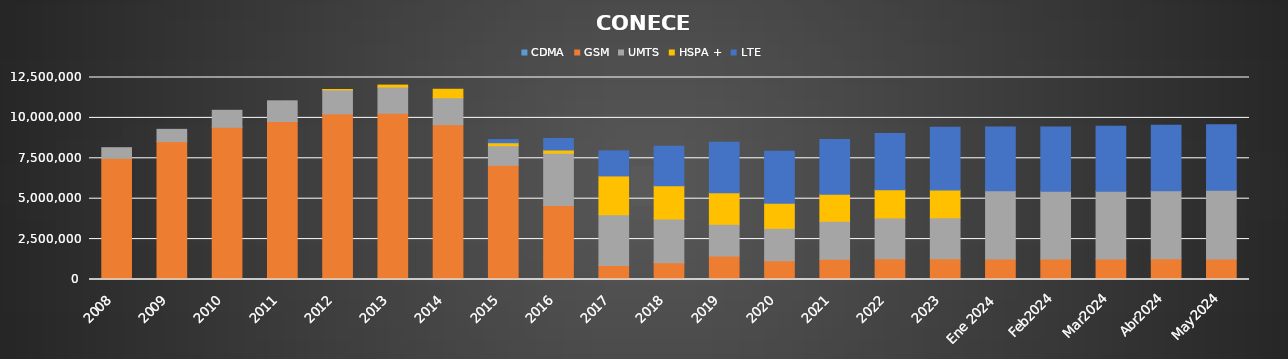
| Category | CDMA | GSM | UMTS | HSPA + | LTE |
|---|---|---|---|---|---|
| 2008 | 0 | 7499370 | 656989 | 0 | 0 |
| 2009 | 0 | 8532691 | 758577 | 0 | 0 |
| 2010 | 0 | 9419193 | 1051309 | 0 | 0 |
| 2011 | 0 | 9774865 | 1282451 | 0 | 0 |
| 2012 | 0 | 10252457 | 1484003 | 21446 | 0 |
| 2013 | 0 | 10287259 | 1622034 | 121593 | 0 |
| 2014 | 0 | 9581956 | 1664758 | 525306 | 0 |
| 2015 | 0 | 7065313 | 1214567 | 183109 | 195630 |
| 2016 | 0 | 4571999 | 3240700 | 201567 | 712557 |
| 2017 | 0 | 873346 | 3135577 | 2399460 | 1551880 |
| 2018 | 0 | 1039373 | 2706058 | 2049418 | 2453201 |
| 2019 | 0 | 1452334 | 1970422 | 1937931 | 3132367 |
| 2020 | 0 | 1158751 | 2009264 | 1548440 | 3212798 |
| 2021 | 0 | 1250925 | 2353798 | 1675346 | 3385646 |
| 2022 | 0 | 1282722 | 2529818 | 1745362 | 3469835 |
| 2023 | 0 | 1278432 | 2540715 | 1722437 | 3884130 |
| Ene 2024 | 0 | 1271343 | 4214554 | 0 | 3949282 |
| Feb2024 | 0 | 1267513 | 4201114 | 0 | 3975397 |
| Mar2024 | 0 | 1275825 | 4180491 | 0 | 4022797 |
| Abr2024 | 0 | 1277802 | 4219594 | 0 | 4050177 |
| May2024 | 0 | 1271686 | 4256009 | 0 | 4051850 |